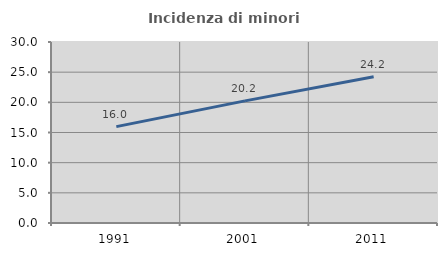
| Category | Incidenza di minori stranieri |
|---|---|
| 1991.0 | 15.97 |
| 2001.0 | 20.238 |
| 2011.0 | 24.23 |